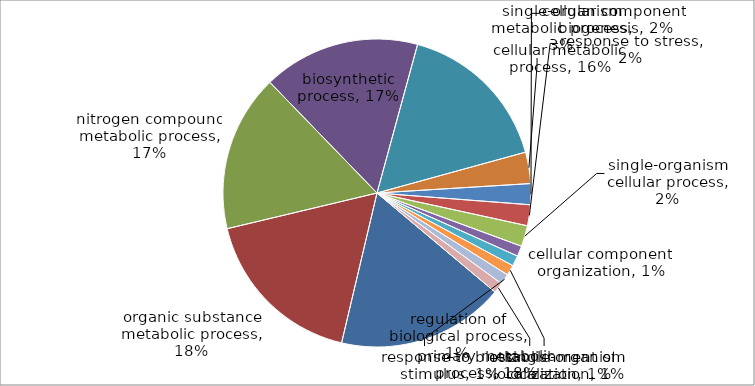
| Category | Series 0 |
|---|---|
| primary metabolic process | 16 |
| organic substance metabolic process | 16 |
| nitrogen compound metabolic process | 15 |
| biosynthetic process | 15 |
| cellular metabolic process | 15 |
| single-organism metabolic process | 3 |
| cellular component biogenesis | 2 |
| response to stress | 2 |
| single-organism cellular process | 2 |
| cellular component organization | 1 |
| regulation of biological process | 1 |
| single-organism localization | 1 |
| response to biotic stimulus | 1 |
| establishment of localization | 1 |